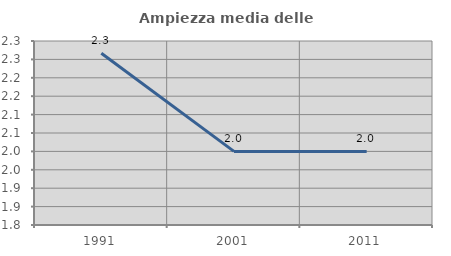
| Category | Ampiezza media delle famiglie |
|---|---|
| 1991.0 | 2.267 |
| 2001.0 | 2 |
| 2011.0 | 2 |